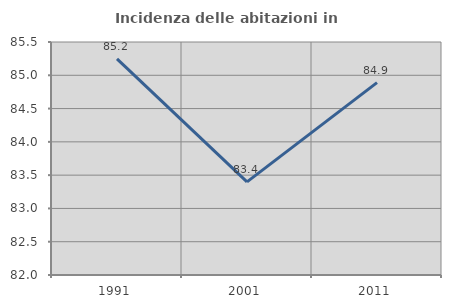
| Category | Incidenza delle abitazioni in proprietà  |
|---|---|
| 1991.0 | 85.246 |
| 2001.0 | 83.399 |
| 2011.0 | 84.889 |